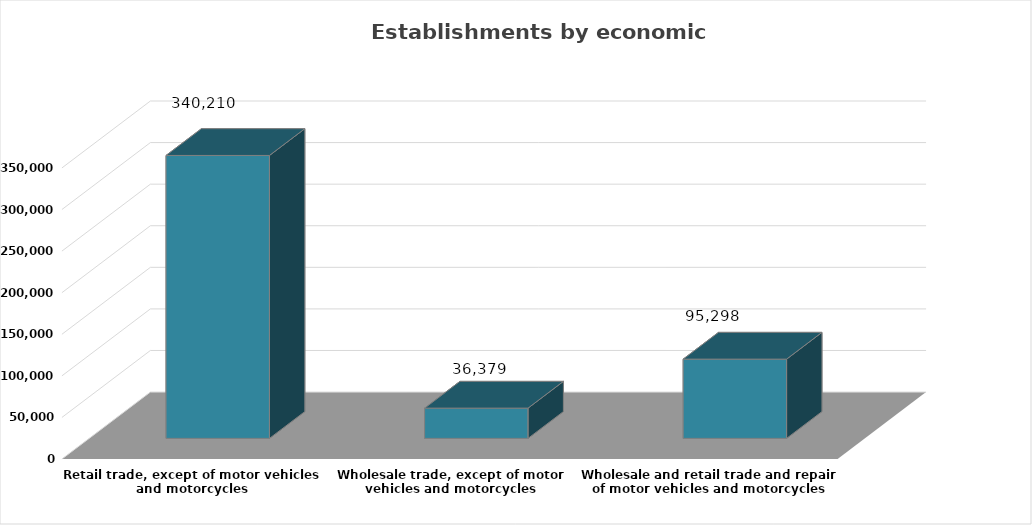
| Category | No. of establishments |
|---|---|
| Wholesale and retail trade and repair of motor vehicles and motorcycles | 95298 |
| Wholesale trade, except of motor vehicles and motorcycles | 36379 |
| Retail trade, except of motor vehicles and motorcycles | 340210 |